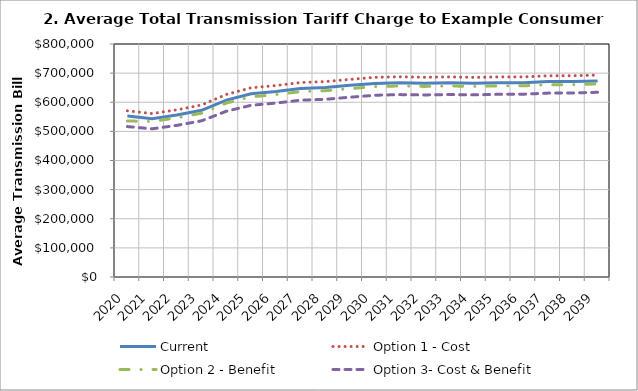
| Category | Current | Option 1 - Cost | Option 2 - Benefit | Option 3- Cost & Benefit |
|---|---|---|---|---|
| 2020.0 | 552526.942 | 570758.926 | 535668.525 | 516472.344 |
| 2021.0 | 543544.424 | 561076.347 | 534073.254 | 508745.281 |
| 2022.0 | 556024.613 | 574088.615 | 546538.726 | 520697.876 |
| 2023.0 | 572352.071 | 590639.015 | 562585.267 | 536271.817 |
| 2024.0 | 607403.394 | 626961.064 | 597148.968 | 569186.247 |
| 2025.0 | 629426.695 | 649613.68 | 618622.757 | 589554.336 |
| 2026.0 | 637177.224 | 657371.694 | 626289.468 | 597135.409 |
| 2027.0 | 647453.726 | 667779.383 | 636440.234 | 607045.189 |
| 2028.0 | 650608.411 | 670995.877 | 639611.255 | 610173.56 |
| 2029.0 | 658060.402 | 678506.522 | 646925.615 | 617303.81 |
| 2030.0 | 664783.841 | 685564.675 | 653797.818 | 624001.6 |
| 2031.0 | 666828.413 | 687401.123 | 655848.652 | 626253.52 |
| 2032.0 | 665262.873 | 685665.426 | 654376.022 | 625027.636 |
| 2033.0 | 666866.115 | 687076.85 | 655895.497 | 626648.46 |
| 2034.0 | 665217.163 | 685268.583 | 654355.039 | 625359.199 |
| 2035.0 | 667105.951 | 687043.25 | 656192.859 | 627256.253 |
| 2036.0 | 667119.899 | 687063.719 | 656388.906 | 627616.987 |
| 2037.0 | 670848.816 | 690839.909 | 660133.364 | 631331.681 |
| 2038.0 | 671213.257 | 691091.928 | 660544.698 | 631892.447 |
| 2039.0 | 673344.39 | 693311.296 | 662818.519 | 634217.343 |